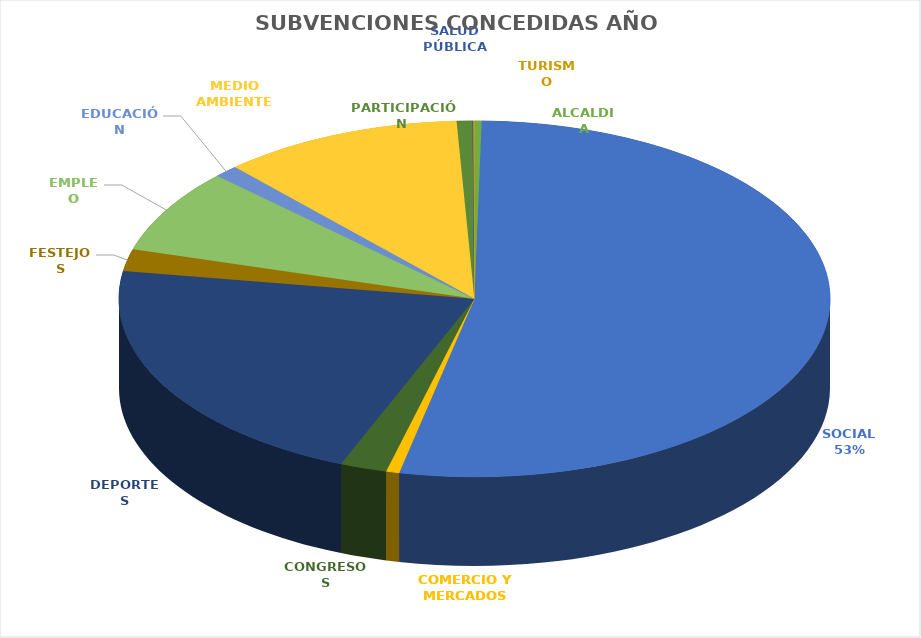
| Category | Series 0 |
|---|---|
| ALCALDIA | 27000 |
| SOCIAL | 4422722.38 |
| COMERCIO Y MERCADOS | 50000 |
| CONGRESOS | 177649.24 |
| DEPORTES | 1782578.82 |
| FESTEJOS | 164817 |
| EMPLEO | 637991.12 |
| EDUCACIÓN | 92230.56 |
| MEDIO AMBIENTE | 912458.78 |
| PARTICIPACIÓN  | 58765.33 |
| SALUD PÚBLICA | 3000 |
| TURISMO | 5000 |